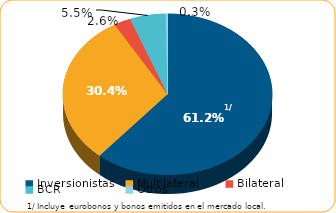
| Category | Series 0 |
|---|---|
| Inversionistas | 7760.4 |
| Multilateral | 3852.8 |
| Bilateral | 328.1 |
| BCR | 704.3 |
| Otros | 33.7 |